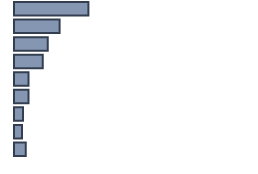
| Category | Percentatge |
|---|---|
| 0 | 31 |
| 1 | 19 |
| 2 | 14.1 |
| 3 | 12 |
| 4 | 6 |
| 5 | 6 |
| 6 | 3.8 |
| 7 | 3.3 |
| 8 | 4.891 |